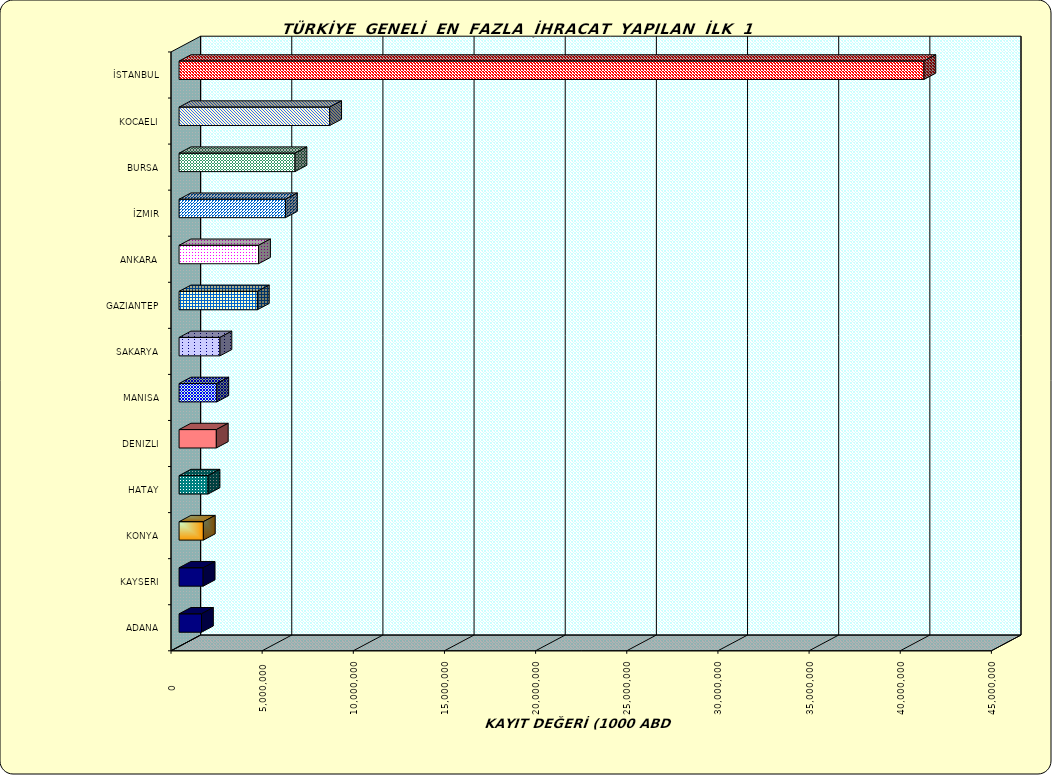
| Category | Series 0 |
|---|---|
| İSTANBUL | 40856704.014 |
| KOCAELI | 8261299.096 |
| BURSA | 6358504.246 |
| İZMIR | 5837505.175 |
| ANKARA | 4360013.595 |
| GAZIANTEP | 4293983.852 |
| SAKARYA | 2242308.216 |
| MANISA | 2070730.983 |
| DENIZLI | 2043254.268 |
| HATAY | 1589831.534 |
| KONYA | 1332585.795 |
| KAYSERI | 1322298.014 |
| ADANA | 1229960.669 |